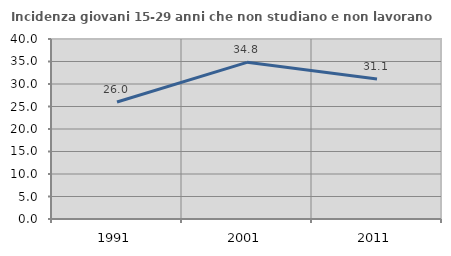
| Category | Incidenza giovani 15-29 anni che non studiano e non lavorano  |
|---|---|
| 1991.0 | 26.006 |
| 2001.0 | 34.82 |
| 2011.0 | 31.114 |